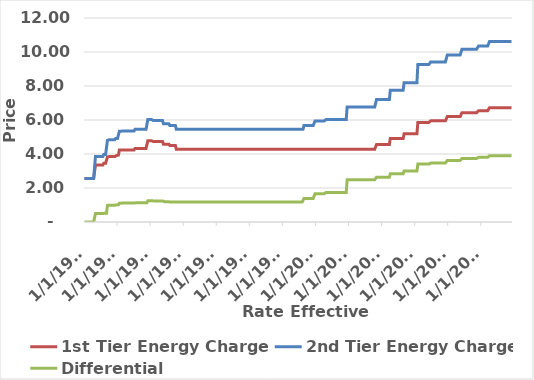
| Category | 1st Tier Energy Charge | 2nd Tier Energy Charge | Differential |
|---|---|---|---|
| 1/1/81 | 2.561 | 2.561 | 0 |
| 2/1/81 | 2.561 | 2.561 | 0 |
| 3/1/81 | 2.561 | 2.561 | 0 |
| 4/1/81 | 2.561 | 2.561 | 0 |
| 5/1/81 | 2.561 | 2.561 | 0 |
| 6/1/81 | 2.561 | 2.561 | 0 |
| 7/1/81 | 2.561 | 2.561 | 0 |
| 8/1/81 | 2.561 | 2.561 | 0 |
| 9/1/81 | 2.561 | 2.561 | 0 |
| 10/1/81 | 2.561 | 2.561 | 0 |
| 11/1/81 | 2.561 | 2.561 | 0 |
| 12/1/81 | 2.561 | 2.561 | 0 |
| 1/1/82 | 3.355 | 3.854 | 0.499 |
| 2/1/82 | 3.355 | 3.854 | 0.499 |
| 3/1/82 | 3.355 | 3.854 | 0.499 |
| 4/1/82 | 3.355 | 3.854 | 0.499 |
| 5/1/82 | 3.355 | 3.854 | 0.499 |
| 6/1/82 | 3.355 | 3.854 | 0.499 |
| 7/1/82 | 3.355 | 3.854 | 0.499 |
| 8/1/82 | 3.355 | 3.854 | 0.499 |
| 9/1/82 | 3.355 | 3.854 | 0.499 |
| 10/1/82 | 3.454 | 3.966 | 0.512 |
| 11/1/82 | 3.454 | 3.966 | 0.512 |
| 12/1/82 | 3.454 | 3.966 | 0.512 |
| 1/1/83 | 3.454 | 3.966 | 0.512 |
| 2/1/83 | 3.824 | 4.801 | 0.977 |
| 3/1/83 | 3.824 | 4.801 | 0.977 |
| 4/1/83 | 3.852 | 4.843 | 0.991 |
| 5/1/83 | 3.852 | 4.843 | 0.991 |
| 6/1/83 | 3.852 | 4.843 | 0.991 |
| 7/1/83 | 3.852 | 4.843 | 0.991 |
| 8/1/83 | 3.852 | 4.843 | 0.991 |
| 9/1/83 | 3.852 | 4.843 | 0.991 |
| 10/1/83 | 3.852 | 4.843 | 0.991 |
| 11/1/83 | 3.909 | 4.915 | 1.006 |
| 12/1/83 | 3.909 | 4.915 | 1.006 |
| 1/1/84 | 3.909 | 4.915 | 1.006 |
| 2/1/84 | 3.935 | 4.948 | 1.013 |
| 3/1/84 | 4.233 | 5.343 | 1.11 |
| 4/1/84 | 4.233 | 5.343 | 1.11 |
| 5/1/84 | 4.233 | 5.343 | 1.11 |
| 6/1/84 | 4.233 | 5.343 | 1.11 |
| 7/1/84 | 4.24 | 5.351 | 1.111 |
| 8/1/84 | 4.24 | 5.351 | 1.111 |
| 9/1/84 | 4.24 | 5.351 | 1.111 |
| 10/1/84 | 4.24 | 5.351 | 1.111 |
| 11/1/84 | 4.24 | 5.351 | 1.111 |
| 12/1/84 | 4.24 | 5.351 | 1.111 |
| 1/1/85 | 4.24 | 5.351 | 1.111 |
| 2/1/85 | 4.24 | 5.351 | 1.111 |
| 3/1/85 | 4.24 | 5.351 | 1.111 |
| 4/1/85 | 4.24 | 5.351 | 1.111 |
| 5/1/85 | 4.24 | 5.351 | 1.111 |
| 6/1/85 | 4.24 | 5.351 | 1.111 |
| 7/1/85 | 4.24 | 5.351 | 1.111 |
| 8/1/85 | 4.321 | 5.452 | 1.131 |
| 9/1/85 | 4.321 | 5.452 | 1.131 |
| 10/1/85 | 4.321 | 5.452 | 1.131 |
| 11/1/85 | 4.321 | 5.452 | 1.131 |
| 12/1/85 | 4.321 | 5.452 | 1.131 |
| 1/1/86 | 4.321 | 5.452 | 1.131 |
| 2/1/86 | 4.321 | 5.452 | 1.131 |
| 3/1/86 | 4.321 | 5.452 | 1.131 |
| 4/1/86 | 4.321 | 5.452 | 1.131 |
| 5/1/86 | 4.321 | 5.452 | 1.131 |
| 6/1/86 | 4.321 | 5.452 | 1.131 |
| 7/1/86 | 4.321 | 5.452 | 1.131 |
| 8/1/86 | 4.321 | 5.452 | 1.131 |
| 9/1/86 | 4.321 | 5.452 | 1.131 |
| 10/1/86 | 4.779 | 6.03 | 1.251 |
| 11/1/86 | 4.779 | 6.03 | 1.251 |
| 12/1/86 | 4.779 | 6.03 | 1.251 |
| 1/1/87 | 4.779 | 6.03 | 1.251 |
| 2/1/87 | 4.779 | 6.03 | 1.251 |
| 3/1/87 | 4.779 | 6.03 | 1.251 |
| 4/1/87 | 4.734 | 5.973 | 1.239 |
| 5/1/87 | 4.734 | 5.973 | 1.239 |
| 6/1/87 | 4.734 | 5.973 | 1.239 |
| 7/1/87 | 4.734 | 5.973 | 1.239 |
| 8/1/87 | 4.734 | 5.973 | 1.239 |
| 9/1/87 | 4.734 | 5.973 | 1.239 |
| 10/1/87 | 4.734 | 5.973 | 1.239 |
| 11/1/87 | 4.734 | 5.973 | 1.239 |
| 12/1/87 | 4.734 | 5.973 | 1.239 |
| 1/1/88 | 4.734 | 5.973 | 1.239 |
| 2/1/88 | 4.734 | 5.973 | 1.239 |
| 3/1/88 | 4.576 | 5.773 | 1.197 |
| 4/1/88 | 4.576 | 5.773 | 1.197 |
| 5/1/88 | 4.576 | 5.773 | 1.197 |
| 6/1/88 | 4.576 | 5.773 | 1.197 |
| 7/1/88 | 4.576 | 5.773 | 1.197 |
| 8/1/88 | 4.576 | 5.773 | 1.197 |
| 9/1/88 | 4.576 | 5.773 | 1.197 |
| 10/1/88 | 4.496 | 5.671 | 1.175 |
| 11/1/88 | 4.496 | 5.671 | 1.175 |
| 12/1/88 | 4.496 | 5.671 | 1.175 |
| 1/1/89 | 4.496 | 5.671 | 1.175 |
| 2/1/89 | 4.496 | 5.671 | 1.175 |
| 3/1/89 | 4.496 | 5.671 | 1.175 |
| 4/1/89 | 4.496 | 5.671 | 1.175 |
| 5/1/89 | 4.285 | 5.46 | 1.175 |
| 6/1/89 | 4.285 | 5.46 | 1.175 |
| 7/1/89 | 4.285 | 5.46 | 1.175 |
| 8/1/89 | 4.285 | 5.46 | 1.175 |
| 9/1/89 | 4.285 | 5.46 | 1.175 |
| 10/1/89 | 4.285 | 5.46 | 1.175 |
| 11/1/89 | 4.285 | 5.46 | 1.175 |
| 12/1/89 | 4.285 | 5.46 | 1.175 |
| 1/1/90 | 4.285 | 5.46 | 1.175 |
| 2/1/90 | 4.285 | 5.46 | 1.175 |
| 3/1/90 | 4.285 | 5.46 | 1.175 |
| 4/1/90 | 4.285 | 5.46 | 1.175 |
| 5/1/90 | 4.285 | 5.46 | 1.175 |
| 6/1/90 | 4.285 | 5.46 | 1.175 |
| 7/1/90 | 4.285 | 5.46 | 1.175 |
| 8/1/90 | 4.285 | 5.46 | 1.175 |
| 9/1/90 | 4.285 | 5.46 | 1.175 |
| 10/1/90 | 4.285 | 5.46 | 1.175 |
| 11/1/90 | 4.285 | 5.46 | 1.175 |
| 12/1/90 | 4.285 | 5.46 | 1.175 |
| 1/1/91 | 4.285 | 5.46 | 1.175 |
| 2/1/91 | 4.285 | 5.46 | 1.175 |
| 3/1/91 | 4.285 | 5.46 | 1.175 |
| 4/1/91 | 4.285 | 5.46 | 1.175 |
| 5/1/91 | 4.285 | 5.46 | 1.175 |
| 6/1/91 | 4.285 | 5.46 | 1.175 |
| 7/1/91 | 4.285 | 5.46 | 1.175 |
| 8/1/91 | 4.285 | 5.46 | 1.175 |
| 9/1/91 | 4.285 | 5.46 | 1.175 |
| 10/1/91 | 4.285 | 5.46 | 1.175 |
| 11/1/91 | 4.285 | 5.46 | 1.175 |
| 12/1/91 | 4.285 | 5.46 | 1.175 |
| 1/1/92 | 4.285 | 5.46 | 1.175 |
| 2/1/92 | 4.285 | 5.46 | 1.175 |
| 3/1/92 | 4.285 | 5.46 | 1.175 |
| 4/1/92 | 4.285 | 5.46 | 1.175 |
| 5/1/92 | 4.285 | 5.46 | 1.175 |
| 6/1/92 | 4.285 | 5.46 | 1.175 |
| 7/1/92 | 4.285 | 5.46 | 1.175 |
| 8/1/92 | 4.285 | 5.46 | 1.175 |
| 9/1/92 | 4.285 | 5.46 | 1.175 |
| 10/1/92 | 4.285 | 5.46 | 1.175 |
| 11/1/92 | 4.285 | 5.46 | 1.175 |
| 12/1/92 | 4.285 | 5.46 | 1.175 |
| 1/1/93 | 4.285 | 5.46 | 1.175 |
| 2/1/93 | 4.285 | 5.46 | 1.175 |
| 3/1/93 | 4.285 | 5.46 | 1.175 |
| 4/1/93 | 4.285 | 5.46 | 1.175 |
| 5/1/93 | 4.285 | 5.46 | 1.175 |
| 6/1/93 | 4.285 | 5.46 | 1.175 |
| 7/1/93 | 4.285 | 5.46 | 1.175 |
| 8/1/93 | 4.285 | 5.46 | 1.175 |
| 9/1/93 | 4.285 | 5.46 | 1.175 |
| 10/1/93 | 4.285 | 5.46 | 1.175 |
| 11/1/93 | 4.285 | 5.46 | 1.175 |
| 12/1/93 | 4.285 | 5.46 | 1.175 |
| 1/1/94 | 4.285 | 5.46 | 1.175 |
| 2/1/94 | 4.285 | 5.46 | 1.175 |
| 3/1/94 | 4.285 | 5.46 | 1.175 |
| 4/1/94 | 4.285 | 5.46 | 1.175 |
| 5/1/94 | 4.285 | 5.46 | 1.175 |
| 6/1/94 | 4.285 | 5.46 | 1.175 |
| 7/1/94 | 4.285 | 5.46 | 1.175 |
| 8/1/94 | 4.285 | 5.46 | 1.175 |
| 9/1/94 | 4.285 | 5.46 | 1.175 |
| 10/1/94 | 4.285 | 5.46 | 1.175 |
| 11/1/94 | 4.285 | 5.46 | 1.175 |
| 12/1/94 | 4.285 | 5.46 | 1.175 |
| 1/1/95 | 4.285 | 5.46 | 1.175 |
| 2/1/95 | 4.285 | 5.46 | 1.175 |
| 3/1/95 | 4.285 | 5.46 | 1.175 |
| 4/1/95 | 4.285 | 5.46 | 1.175 |
| 5/1/95 | 4.285 | 5.46 | 1.175 |
| 6/1/95 | 4.285 | 5.46 | 1.175 |
| 7/1/95 | 4.285 | 5.46 | 1.175 |
| 8/1/95 | 4.285 | 5.46 | 1.175 |
| 9/1/95 | 4.285 | 5.46 | 1.175 |
| 10/1/95 | 4.285 | 5.46 | 1.175 |
| 11/1/95 | 4.285 | 5.46 | 1.175 |
| 12/1/95 | 4.285 | 5.46 | 1.175 |
| 1/1/96 | 4.285 | 5.46 | 1.175 |
| 2/1/96 | 4.285 | 5.46 | 1.175 |
| 3/1/96 | 4.285 | 5.46 | 1.175 |
| 4/1/96 | 4.285 | 5.46 | 1.175 |
| 5/1/96 | 4.285 | 5.46 | 1.175 |
| 6/1/96 | 4.285 | 5.46 | 1.175 |
| 7/1/96 | 4.285 | 5.46 | 1.175 |
| 8/1/96 | 4.285 | 5.46 | 1.175 |
| 9/1/96 | 4.285 | 5.46 | 1.175 |
| 10/1/96 | 4.285 | 5.46 | 1.175 |
| 11/1/96 | 4.285 | 5.46 | 1.175 |
| 12/1/96 | 4.285 | 5.46 | 1.175 |
| 1/1/97 | 4.285 | 5.46 | 1.175 |
| 2/1/97 | 4.285 | 5.46 | 1.175 |
| 3/1/97 | 4.285 | 5.46 | 1.175 |
| 4/1/97 | 4.285 | 5.46 | 1.175 |
| 5/1/97 | 4.285 | 5.46 | 1.175 |
| 6/1/97 | 4.285 | 5.46 | 1.175 |
| 7/1/97 | 4.285 | 5.46 | 1.175 |
| 8/1/97 | 4.285 | 5.46 | 1.175 |
| 9/1/97 | 4.285 | 5.46 | 1.175 |
| 10/1/97 | 4.285 | 5.46 | 1.175 |
| 11/1/97 | 4.285 | 5.46 | 1.175 |
| 12/1/97 | 4.285 | 5.46 | 1.175 |
| 1/1/98 | 4.285 | 5.46 | 1.175 |
| 2/1/98 | 4.285 | 5.46 | 1.175 |
| 3/1/98 | 4.285 | 5.46 | 1.175 |
| 4/1/98 | 4.285 | 5.46 | 1.175 |
| 5/1/98 | 4.285 | 5.46 | 1.175 |
| 6/1/98 | 4.285 | 5.46 | 1.175 |
| 7/1/98 | 4.285 | 5.46 | 1.175 |
| 8/1/98 | 4.285 | 5.46 | 1.175 |
| 9/1/98 | 4.285 | 5.46 | 1.175 |
| 10/1/98 | 4.285 | 5.46 | 1.175 |
| 11/1/98 | 4.285 | 5.46 | 1.175 |
| 12/1/98 | 4.285 | 5.46 | 1.175 |
| 1/1/99 | 4.285 | 5.46 | 1.175 |
| 2/1/99 | 4.285 | 5.46 | 1.175 |
| 3/1/99 | 4.285 | 5.46 | 1.175 |
| 4/1/99 | 4.285 | 5.46 | 1.175 |
| 5/1/99 | 4.285 | 5.46 | 1.175 |
| 6/1/99 | 4.285 | 5.46 | 1.175 |
| 7/1/99 | 4.285 | 5.46 | 1.175 |
| 8/1/99 | 4.285 | 5.46 | 1.175 |
| 9/1/99 | 4.285 | 5.46 | 1.175 |
| 10/1/99 | 4.285 | 5.46 | 1.175 |
| 11/1/99 | 4.285 | 5.46 | 1.175 |
| 12/1/99 | 4.285 | 5.46 | 1.175 |
| 1/1/00 | 4.285 | 5.46 | 1.175 |
| 2/1/00 | 4.285 | 5.46 | 1.175 |
| 3/1/00 | 4.285 | 5.46 | 1.175 |
| 4/1/00 | 4.285 | 5.46 | 1.175 |
| 5/1/00 | 4.285 | 5.46 | 1.175 |
| 6/1/00 | 4.285 | 5.46 | 1.175 |
| 7/1/00 | 4.285 | 5.46 | 1.175 |
| 8/1/00 | 4.285 | 5.46 | 1.175 |
| 9/1/00 | 4.285 | 5.46 | 1.175 |
| 10/1/00 | 4.285 | 5.46 | 1.175 |
| 11/1/00 | 4.285 | 5.46 | 1.175 |
| 12/1/00 | 4.285 | 5.672 | 1.387 |
| 1/1/01 | 4.285 | 5.672 | 1.387 |
| 2/1/01 | 4.285 | 5.672 | 1.387 |
| 3/1/01 | 4.285 | 5.672 | 1.387 |
| 4/1/01 | 4.285 | 5.672 | 1.387 |
| 5/1/01 | 4.285 | 5.672 | 1.387 |
| 6/1/01 | 4.285 | 5.672 | 1.387 |
| 7/1/01 | 4.285 | 5.672 | 1.387 |
| 8/1/01 | 4.285 | 5.672 | 1.387 |
| 9/1/01 | 4.285 | 5.672 | 1.387 |
| 10/1/01 | 4.285 | 5.672 | 1.387 |
| 11/1/01 | 4.285 | 5.672 | 1.387 |
| 12/1/01 | 4.285 | 5.94 | 1.655 |
| 1/1/02 | 4.285 | 5.94 | 1.655 |
| 2/1/02 | 4.285 | 5.94 | 1.655 |
| 3/1/02 | 4.285 | 5.94 | 1.655 |
| 4/1/02 | 4.285 | 5.94 | 1.655 |
| 5/1/02 | 4.285 | 5.94 | 1.655 |
| 6/1/02 | 4.285 | 5.94 | 1.655 |
| 7/1/02 | 4.285 | 5.94 | 1.655 |
| 8/1/02 | 4.285 | 5.94 | 1.655 |
| 9/1/02 | 4.285 | 5.94 | 1.655 |
| 10/1/02 | 4.285 | 5.94 | 1.655 |
| 11/1/02 | 4.285 | 5.94 | 1.655 |
| 12/1/02 | 4.285 | 6.025 | 1.74 |
| 1/1/03 | 4.285 | 6.025 | 1.74 |
| 2/1/03 | 4.285 | 6.025 | 1.74 |
| 3/1/03 | 4.285 | 6.025 | 1.74 |
| 4/1/03 | 4.285 | 6.025 | 1.74 |
| 5/1/03 | 4.285 | 6.025 | 1.74 |
| 6/1/03 | 4.285 | 6.025 | 1.74 |
| 7/1/03 | 4.285 | 6.025 | 1.74 |
| 8/1/03 | 4.285 | 6.025 | 1.74 |
| 9/1/03 | 4.285 | 6.025 | 1.74 |
| 10/1/03 | 4.285 | 6.025 | 1.74 |
| 11/1/03 | 4.285 | 6.025 | 1.74 |
| 12/1/03 | 4.285 | 6.025 | 1.74 |
| 1/1/04 | 4.285 | 6.025 | 1.74 |
| 2/1/04 | 4.285 | 6.025 | 1.74 |
| 3/1/04 | 4.285 | 6.025 | 1.74 |
| 4/1/04 | 4.285 | 6.025 | 1.74 |
| 5/1/04 | 4.285 | 6.025 | 1.74 |
| 6/1/04 | 4.285 | 6.025 | 1.74 |
| 7/1/04 | 4.285 | 6.025 | 1.74 |
| 8/1/04 | 4.285 | 6.025 | 1.74 |
| 9/1/04 | 4.285 | 6.025 | 1.74 |
| 10/1/04 | 4.285 | 6.025 | 1.74 |
| 11/1/04 | 4.285 | 6.766 | 2.481 |
| 12/1/04 | 4.285 | 6.766 | 2.481 |
| 1/1/05 | 4.285 | 6.766 | 2.481 |
| 2/1/05 | 4.285 | 6.766 | 2.481 |
| 3/1/05 | 4.285 | 6.766 | 2.481 |
| 4/1/05 | 4.285 | 6.766 | 2.481 |
| 5/1/05 | 4.285 | 6.766 | 2.481 |
| 6/1/05 | 4.285 | 6.766 | 2.481 |
| 7/1/05 | 4.285 | 6.766 | 2.481 |
| 8/1/05 | 4.285 | 6.766 | 2.481 |
| 9/1/05 | 4.285 | 6.766 | 2.481 |
| 10/1/05 | 4.285 | 6.766 | 2.481 |
| 11/1/05 | 4.285 | 6.766 | 2.481 |
| 12/1/05 | 4.285 | 6.766 | 2.481 |
| 1/1/06 | 4.285 | 6.766 | 2.481 |
| 2/1/06 | 4.285 | 6.766 | 2.481 |
| 3/1/06 | 4.285 | 6.766 | 2.481 |
| 4/1/06 | 4.285 | 6.766 | 2.481 |
| 5/1/06 | 4.285 | 6.766 | 2.481 |
| 6/1/06 | 4.285 | 6.766 | 2.481 |
| 7/1/06 | 4.285 | 6.766 | 2.481 |
| 8/1/06 | 4.285 | 6.766 | 2.481 |
| 9/1/06 | 4.285 | 6.766 | 2.481 |
| 10/1/06 | 4.285 | 6.766 | 2.481 |
| 11/1/06 | 4.285 | 6.766 | 2.481 |
| 12/1/06 | 4.285 | 6.766 | 2.481 |
| 1/1/07 | 4.285 | 6.766 | 2.481 |
| 2/1/07 | 4.285 | 6.766 | 2.481 |
| 3/1/07 | 4.285 | 6.766 | 2.481 |
| 4/1/07 | 4.285 | 6.766 | 2.481 |
| 5/1/07 | 4.285 | 6.766 | 2.481 |
| 6/1/07 | 4.285 | 6.766 | 2.481 |
| 7/1/07 | 4.562 | 7.201 | 2.639 |
| 8/1/07 | 4.562 | 7.201 | 2.639 |
| 9/1/07 | 4.562 | 7.201 | 2.639 |
| 10/1/07 | 4.562 | 7.201 | 2.639 |
| 11/1/07 | 4.562 | 7.201 | 2.639 |
| 12/1/07 | 4.562 | 7.201 | 2.639 |
| 1/1/08 | 4.562 | 7.201 | 2.639 |
| 2/1/08 | 4.562 | 7.201 | 2.639 |
| 3/1/08 | 4.562 | 7.201 | 2.639 |
| 4/1/08 | 4.562 | 7.201 | 2.639 |
| 5/1/08 | 4.562 | 7.201 | 2.639 |
| 6/1/08 | 4.562 | 7.201 | 2.639 |
| 7/1/08 | 4.562 | 7.201 | 2.639 |
| 8/1/08 | 4.562 | 7.201 | 2.639 |
| 9/1/08 | 4.562 | 7.201 | 2.639 |
| 10/1/08 | 4.914 | 7.751 | 2.837 |
| 11/1/08 | 4.914 | 7.751 | 2.837 |
| 12/1/08 | 4.914 | 7.751 | 2.837 |
| 1/1/09 | 4.914 | 7.751 | 2.837 |
| 2/1/09 | 4.914 | 7.751 | 2.837 |
| 3/1/09 | 4.914 | 7.751 | 2.837 |
| 4/1/09 | 4.914 | 7.751 | 2.837 |
| 5/1/09 | 4.914 | 7.751 | 2.837 |
| 6/1/09 | 4.914 | 7.751 | 2.837 |
| 7/1/09 | 4.914 | 7.751 | 2.837 |
| 8/1/09 | 4.914 | 7.751 | 2.837 |
| 9/1/09 | 4.914 | 7.751 | 2.837 |
| 10/1/09 | 4.914 | 7.751 | 2.837 |
| 11/1/09 | 4.914 | 7.751 | 2.837 |
| 12/1/09 | 4.914 | 7.751 | 2.837 |
| 1/1/10 | 5.193 | 8.193 | 3 |
| 2/1/10 | 5.193 | 8.193 | 3 |
| 3/1/10 | 5.193 | 8.193 | 3 |
| 4/1/10 | 5.193 | 8.193 | 3 |
| 5/1/10 | 5.193 | 8.193 | 3 |
| 6/1/10 | 5.193 | 8.193 | 3 |
| 7/1/10 | 5.193 | 8.193 | 3 |
| 8/1/10 | 5.193 | 8.193 | 3 |
| 9/1/10 | 5.193 | 8.193 | 3 |
| 10/1/10 | 5.193 | 8.193 | 3 |
| 11/1/10 | 5.193 | 8.193 | 3 |
| 12/1/10 | 5.193 | 8.193 | 3 |
| 1/1/11 | 5.193 | 8.193 | 3 |
| 2/1/11 | 5.193 | 8.193 | 3 |
| 3/1/11 | 5.193 | 8.193 | 3 |
| 4/1/11 | 5.858 | 9.264 | 3.406 |
| 5/1/11 | 5.858 | 9.264 | 3.406 |
| 6/1/11 | 5.858 | 9.264 | 3.406 |
| 7/1/11 | 5.858 | 9.264 | 3.406 |
| 8/1/11 | 5.858 | 9.264 | 3.406 |
| 9/1/11 | 5.858 | 9.264 | 3.406 |
| 10/1/11 | 5.858 | 9.264 | 3.406 |
| 11/1/11 | 5.858 | 9.264 | 3.406 |
| 12/1/11 | 5.858 | 9.264 | 3.406 |
| 1/1/12 | 5.858 | 9.264 | 3.406 |
| 2/1/12 | 5.858 | 9.264 | 3.406 |
| 3/1/12 | 5.858 | 9.264 | 3.406 |
| 4/1/12 | 5.858 | 9.264 | 3.406 |
| 5/1/12 | 5.858 | 9.264 | 3.406 |
| 6/1/12 | 5.949 | 9.416 | 3.467 |
| 7/1/12 | 5.949 | 9.416 | 3.467 |
| 8/1/12 | 5.949 | 9.416 | 3.467 |
| 9/1/12 | 5.949 | 9.416 | 3.467 |
| 10/1/12 | 5.949 | 9.416 | 3.467 |
| 11/1/12 | 5.949 | 9.416 | 3.467 |
| 12/1/12 | 5.949 | 9.416 | 3.467 |
| 1/1/13 | 5.949 | 9.416 | 3.467 |
| 2/1/13 | 5.949 | 9.416 | 3.467 |
| 3/1/13 | 5.949 | 9.416 | 3.467 |
| 4/1/13 | 5.949 | 9.416 | 3.467 |
| 5/1/13 | 5.949 | 9.416 | 3.467 |
| 6/1/13 | 5.949 | 9.416 | 3.467 |
| 7/1/13 | 5.949 | 9.416 | 3.467 |
| 8/1/13 | 5.949 | 9.416 | 3.467 |
| 9/1/13 | 5.949 | 9.416 | 3.467 |
| 10/1/13 | 5.949 | 9.416 | 3.467 |
| 11/1/13 | 5.949 | 9.416 | 3.467 |
| 12/1/13 | 6.199 | 9.817 | 3.618 |
| 1/1/14 | 6.199 | 9.817 | 3.618 |
| 2/1/14 | 6.199 | 9.817 | 3.618 |
| 3/1/14 | 6.199 | 9.817 | 3.618 |
| 4/1/14 | 6.199 | 9.817 | 3.618 |
| 5/1/14 | 6.199 | 9.817 | 3.618 |
| 6/1/14 | 6.199 | 9.817 | 3.618 |
| 7/1/14 | 6.199 | 9.817 | 3.618 |
| 8/1/14 | 6.199 | 9.817 | 3.618 |
| 9/1/14 | 6.199 | 9.817 | 3.618 |
| 10/1/14 | 6.199 | 9.817 | 3.618 |
| 11/1/14 | 6.199 | 9.817 | 3.618 |
| 12/1/14 | 6.199 | 9.817 | 3.618 |
| 1/1/15 | 6.199 | 9.817 | 3.618 |
| 2/1/15 | 6.199 | 9.817 | 3.618 |
| 3/1/15 | 6.199 | 9.817 | 3.618 |
| 4/1/15 | 6.425 | 10.166 | 3.741 |
| 5/1/15 | 6.425 | 10.166 | 3.741 |
| 6/1/15 | 6.425 | 10.166 | 3.741 |
| 7/1/15 | 6.425 | 10.166 | 3.741 |
| 8/1/15 | 6.425 | 10.166 | 3.741 |
| 9/1/15 | 6.425 | 10.166 | 3.741 |
| 10/1/15 | 6.425 | 10.166 | 3.741 |
| 11/1/15 | 6.425 | 10.166 | 3.741 |
| 12/1/15 | 6.425 | 10.166 | 3.741 |
| 1/1/16 | 6.425 | 10.166 | 3.741 |
| 2/1/16 | 6.425 | 10.166 | 3.741 |
| 3/1/16 | 6.425 | 10.166 | 3.741 |
| 4/1/16 | 6.425 | 10.166 | 3.741 |
| 5/1/16 | 6.425 | 10.166 | 3.741 |
| 6/1/16 | 6.425 | 10.166 | 3.741 |
| 7/1/16 | 6.425 | 10.166 | 3.741 |
| 8/1/16 | 6.425 | 10.166 | 3.741 |
| 9/1/16 | 6.425 | 10.166 | 3.741 |
| 10/1/16 | 6.548 | 10.35 | 3.802 |
| 11/1/16 | 6.548 | 10.35 | 3.802 |
| 12/1/16 | 6.548 | 10.35 | 3.802 |
| 1/1/17 | 6.548 | 10.35 | 3.802 |
| 2/1/17 | 6.548 | 10.35 | 3.802 |
| 3/1/17 | 6.548 | 10.35 | 3.802 |
| 4/1/17 | 6.548 | 10.35 | 3.802 |
| 5/1/17 | 6.548 | 10.35 | 3.802 |
| 6/1/17 | 6.548 | 10.35 | 3.802 |
| 7/1/17 | 6.548 | 10.35 | 3.802 |
| 8/1/17 | 6.548 | 10.35 | 3.802 |
| 9/1/17 | 6.548 | 10.35 | 3.802 |
| 10/1/17 | 6.717 | 10.613 | 3.896 |
| 11/1/17 | 6.717 | 10.613 | 3.896 |
| 12/1/17 | 6.717 | 10.613 | 3.896 |
| 1/1/18 | 6.717 | 10.613 | 3.896 |
| 2/1/18 | 6.717 | 10.613 | 3.896 |
| 3/1/18 | 6.717 | 10.613 | 3.896 |
| 4/1/18 | 6.717 | 10.613 | 3.896 |
| 5/1/18 | 6.717 | 10.613 | 3.896 |
| 6/1/18 | 6.717 | 10.613 | 3.896 |
| 7/1/18 | 6.717 | 10.613 | 3.896 |
| 8/1/18 | 6.717 | 10.613 | 3.896 |
| 9/1/18 | 6.717 | 10.613 | 3.896 |
| 10/1/18 | 6.717 | 10.613 | 3.896 |
| 11/1/18 | 6.717 | 10.613 | 3.896 |
| 12/1/18 | 6.717 | 10.613 | 3.896 |
| 1/1/19 | 6.717 | 10.613 | 3.896 |
| 2/1/19 | 6.717 | 10.613 | 3.896 |
| 3/1/19 | 6.717 | 10.613 | 3.896 |
| 4/1/19 | 6.717 | 10.613 | 3.896 |
| 5/1/19 | 6.717 | 10.613 | 3.896 |
| 6/1/19 | 6.717 | 10.613 | 3.896 |
| 7/1/19 | 6.717 | 10.613 | 3.896 |
| 8/1/19 | 6.717 | 10.613 | 3.896 |
| 9/1/19 | 6.717 | 10.613 | 3.896 |
| 10/1/19 | 6.717 | 10.613 | 3.896 |